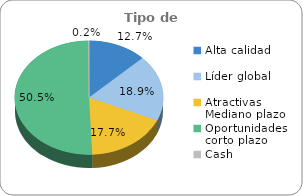
| Category | Series 0 |
|---|---|
| Alta calidad | 0.127 |
| Líder global | 0.189 |
| Atractivas Mediano plazo | 0.177 |
| Oportunidades corto plazo | 0.505 |
| Cash | 0.002 |